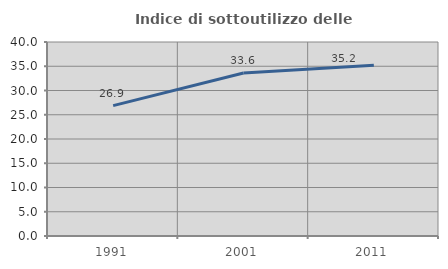
| Category | Indice di sottoutilizzo delle abitazioni  |
|---|---|
| 1991.0 | 26.879 |
| 2001.0 | 33.607 |
| 2011.0 | 35.19 |